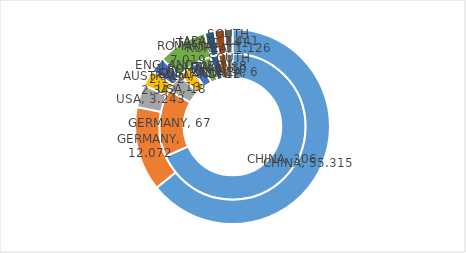
| Category | Series 0 | Series 1 |
|---|---|---|
| CHINA | 306 | 55.315 |
| GERMANY | 67 | 12.072 |
| USA | 18 | 3.243 |
| AUSTRALIA | 13 | 2.342 |
| ENGLAND | 12 | 2.162 |
| ROMANIA | 10 | 7.019 |
| ITALY | 8 | 1.441 |
| JAPAN | 8 | 1.441 |
| SOUTH KOREA | 6 | 1.126 |